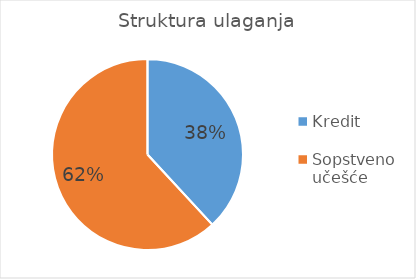
| Category | Series 0 |
|---|---|
| Kredit | 40000 |
| Sopstveno učešće | 64907 |